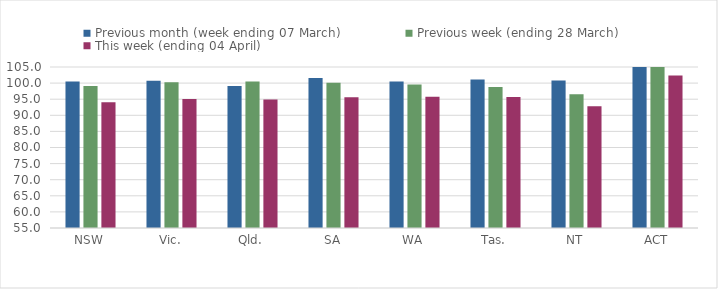
| Category | Previous month (week ending 07 March) | Previous week (ending 28 March) | This week (ending 04 April) |
|---|---|---|---|
| NSW | 100.529 | 99.117 | 94.069 |
| Vic. | 100.757 | 100.242 | 95.097 |
| Qld. | 99.126 | 100.475 | 94.924 |
| SA | 101.605 | 100.105 | 95.641 |
| WA | 100.52 | 99.592 | 95.768 |
| Tas. | 101.117 | 98.765 | 95.65 |
| NT | 100.829 | 96.547 | 92.818 |
| ACT | 105.51 | 107.653 | 102.347 |